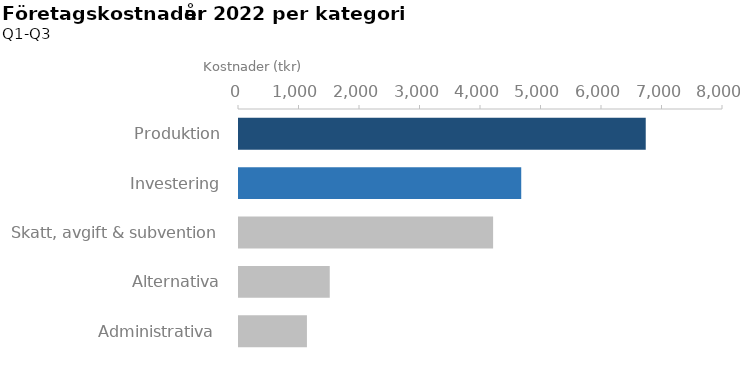
| Category | Belopp (tkr) |
|---|---|
| Administrativa  | 1123 |
| Alternativa | 1500 |
| Skatt, avgift & subvention | 4200 |
| Investering | 4665 |
| Produktion | 6723 |